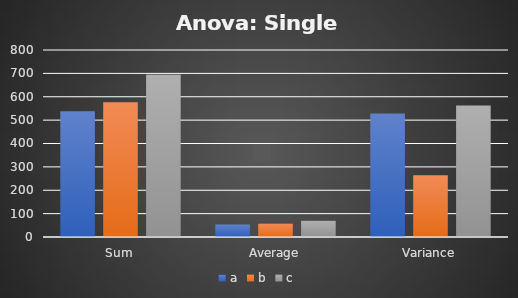
| Category | a | b | c |
|---|---|---|---|
| Sum | 538 | 577 | 695 |
| Average | 53.8 | 57.7 | 69.5 |
| Variance | 528.622 | 264.011 | 562.944 |